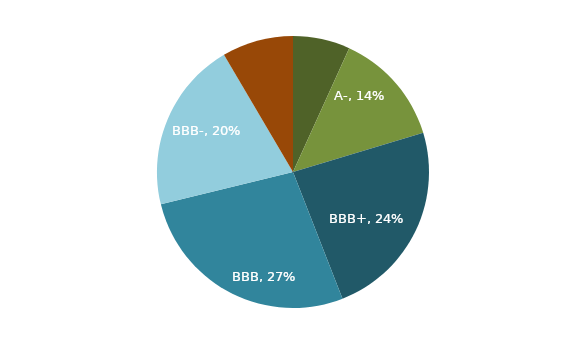
| Category | Series 0 |
|---|---|
| A or higher | 0.068 |
| A- | 0.136 |
| BBB+ | 0.237 |
| BBB | 0.271 |
| BBB- | 0.203 |
| Below BBB- | 0.085 |